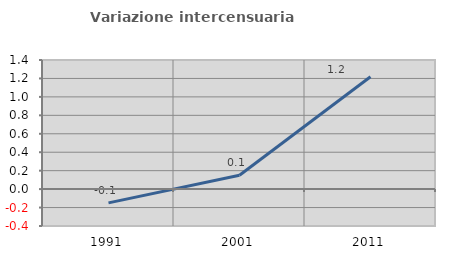
| Category | Variazione intercensuaria annua |
|---|---|
| 1991.0 | -0.15 |
| 2001.0 | 0.15 |
| 2011.0 | 1.218 |